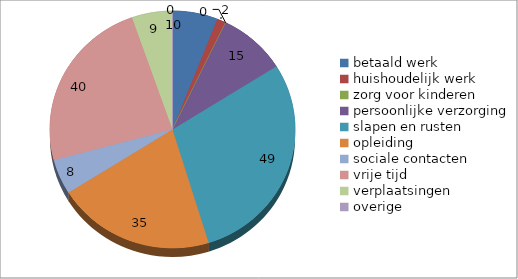
| Category | Series 0 | Series 1 | Series 2 |
|---|---|---|---|
| betaald werk | 10 | 168 | 5.952 |
| huishoudelijk werk | 2 | 168 | 1.19 |
| zorg voor kinderen | 0 | 168 | 0 |
| persoonlijke verzorging | 15 | 168 | 8.929 |
| slapen en rusten | 49 | 168 | 29.167 |
| opleiding | 35 | 168 | 20.833 |
| sociale contacten | 8 | 168 | 4.762 |
| vrije tijd | 40 | 168 | 23.81 |
| verplaatsingen | 9 | 168 | 5.357 |
| overige  | 0 | 168 | 0 |